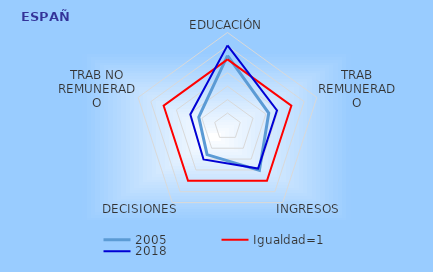
| Category | 2005 | Igualdad=1 | 2018 |
|---|---|---|---|
| EDUCACIÓN | 1.055 | 1 | 1.208 |
| TRAB REMUNERADO | 0.646 | 1 | 0.775 |
| INGRESOS | 0.808 | 1 | 0.775 |
| DECISIONES | 0.518 | 1 | 0.607 |
| TRAB NO REMUNERADO | 0.45 | 1 | 0.582 |